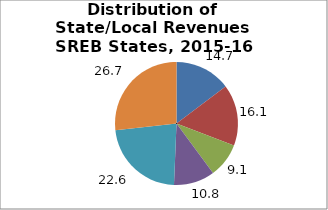
| Category | Series 0 |
|---|---|
| General Sales | 14.711 |
| Property | 16.09 |
| Income₁ | 9.084 |
| Other | 10.767 |
| From Federal Government | 22.623 |
| Nontax Revenues₂ | 26.726 |